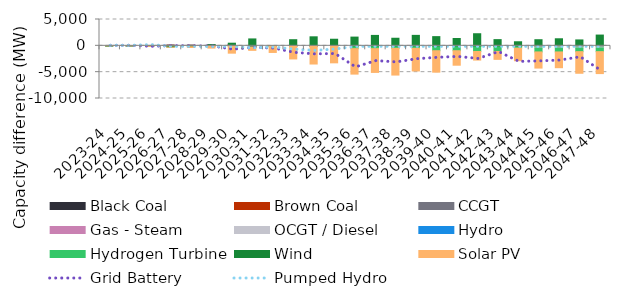
| Category | Black Coal | Brown Coal | CCGT | Gas - Steam | OCGT / Diesel | Hydro | Hydrogen Turbine | Wind | Solar PV |
|---|---|---|---|---|---|---|---|---|---|
| 2023-24 | 0 | 0 | 0 | 0 | -0.005 | 0 | 0 | -71.982 | 0.015 |
| 2024-25 | 0 | 0 | 0.002 | 0 | -0.003 | 0 | 0 | -39.954 | 0.029 |
| 2025-26 | 47.134 | -46.048 | 0.003 | 0 | 0 | 0 | 0 | -49.405 | -17.253 |
| 2026-27 | -6.196 | 146.347 | 0.003 | 0 | 0 | 0 | 0 | -237.588 | -21.269 |
| 2027-28 | 9.747 | 146.396 | 0.003 | 0 | 0 | 0 | 0 | -169.752 | -141.738 |
| 2028-29 | 7.486 | 169.784 | 0.003 | 0 | 0 | 0 | 0 | 57.208 | -429.757 |
| 2029-30 | -20.247 | 268.19 | 0.003 | 0 | 0 | 0 | 0 | 231.295 | -1371.305 |
| 2030-31 | -251.289 | -0.01 | 0.003 | 0 | 0.001 | 0 | 0.003 | 1311.337 | -606.95 |
| 2031-32 | 0.015 | 0.001 | 0.003 | 0 | 0.001 | 0 | 0.003 | 67.767 | -1257.315 |
| 2032-33 | 0.025 | 0.001 | 0.003 | 0 | 0.001 | 0 | 0.004 | 1163.784 | -2488.436 |
| 2033-34 | 0.022 | 0.001 | 0.003 | 0 | 0.001 | 0 | 0.004 | 1712.592 | -3454.201 |
| 2034-35 | 0.022 | 0.001 | 0.003 | 0 | 0.001 | 0 | 0.004 | 1252.704 | -3228.384 |
| 2035-36 | 0.018 | 0.001 | 0.003 | 0 | -0.022 | 0 | -534.23 | 1659.025 | -4835.515 |
| 2036-37 | 0.016 | 0.002 | 0.003 | 0 | -0.022 | 0 | -534.228 | 1978.916 | -4512.145 |
| 2037-38 | 0.014 | 0.002 | 0.003 | 0 | -0.027 | 0 | -475.745 | 1440.564 | -5074.745 |
| 2038-39 | 0.016 | 0.002 | 0.003 | 0 | -0.027 | 0 | -475.745 | 1986.879 | -4293.105 |
| 2039-40 | 0.016 | 0.002 | 0.003 | 0 | -0.027 | 0 | -927.522 | 1747.266 | -4070.497 |
| 2040-41 | 0.013 | 0.002 | 0.006 | 0 | -0.026 | 0 | -927.522 | 1393.089 | -2752.64 |
| 2041-42 | 0.013 | 0.001 | 0.004 | 0 | -0.026 | 0 | -1068.583 | 2297.448 | -1631.401 |
| 2042-43 | 0.012 | 0.001 | 0.005 | 0 | -0.025 | 0 | -1068.582 | 1178.601 | -1500.453 |
| 2043-44 | 0.011 | 0.001 | 0.004 | 0 | -0.185 | 0 | -434.93 | 771.845 | -2395.727 |
| 2044-45 | 0.009 | 0.001 | 0.004 | 0 | -406.36 | 0 | -747.975 | 1161.596 | -3068.718 |
| 2045-46 | 0.008 | 0.001 | 0.004 | 0 | -406.359 | 0 | -747.975 | 1340.618 | -2998.11 |
| 2046-47 | 0.007 | 0.001 | 0.009 | 0 | -406.357 | 0 | -698.441 | 1121.808 | -4104.479 |
| 2047-48 | 0.007 | 0 | 0.009 | 0 | -406.356 | 0 | -698.44 | 2044.052 | -4165.425 |